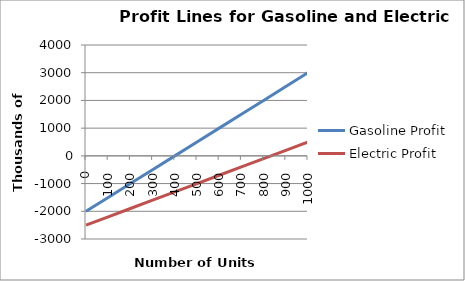
| Category | Gasoline Profit | Electric Profit |
|---|---|---|
| 0.0 | -2000 | -2500 |
| 100.0 | -1500 | -2200 |
| 200.0 | -1000 | -1900 |
| 300.0 | -500 | -1600 |
| 400.0 | 0 | -1300 |
| 500.0 | 500 | -1000 |
| 600.0 | 1000 | -700 |
| 700.0 | 1500 | -400 |
| 800.0 | 2000 | -100 |
| 900.0 | 2500 | 200 |
| 1000.0 | 3000 | 500 |